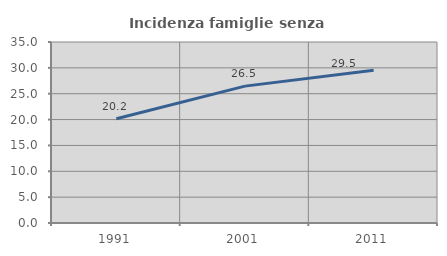
| Category | Incidenza famiglie senza nuclei |
|---|---|
| 1991.0 | 20.167 |
| 2001.0 | 26.468 |
| 2011.0 | 29.518 |